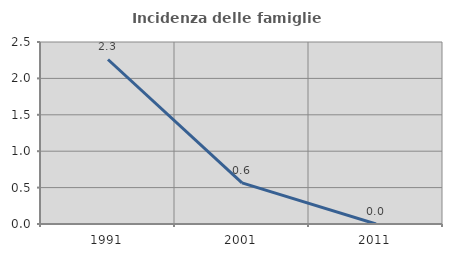
| Category | Incidenza delle famiglie numerose |
|---|---|
| 1991.0 | 2.26 |
| 2001.0 | 0.565 |
| 2011.0 | 0 |